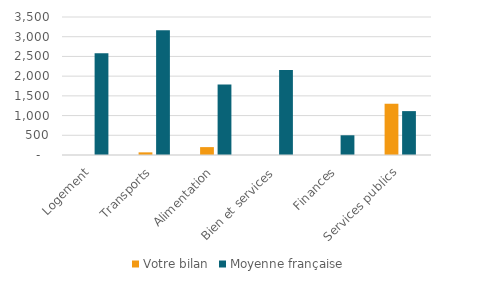
| Category | Votre bilan | Series 1 | Moyenne française |
|---|---|---|---|
| Logement | 0 |  | 2579 |
| Transports | 67.2 |  | 3165 |
| Alimentation | 200 |  | 1789 |
| Bien et services | 0 |  | 2158 |
| Finances | 0 |  | 500 |
| Services publics | 1300 |  | 1113 |